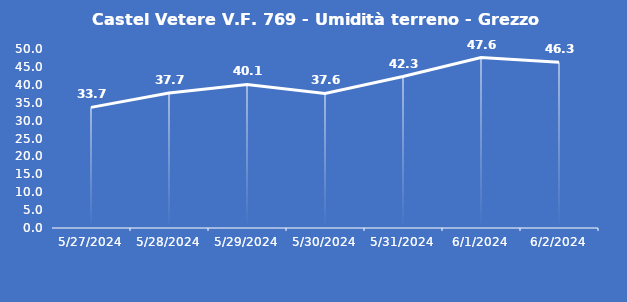
| Category | Castel Vetere V.F. 769 - Umidità terreno - Grezzo (%VWC) |
|---|---|
| 5/27/24 | 33.7 |
| 5/28/24 | 37.7 |
| 5/29/24 | 40.1 |
| 5/30/24 | 37.6 |
| 5/31/24 | 42.3 |
| 6/1/24 | 47.6 |
| 6/2/24 | 46.3 |